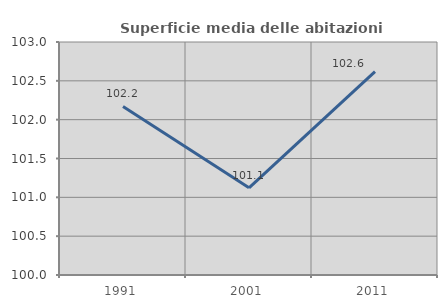
| Category | Superficie media delle abitazioni occupate |
|---|---|
| 1991.0 | 102.17 |
| 2001.0 | 101.122 |
| 2011.0 | 102.62 |